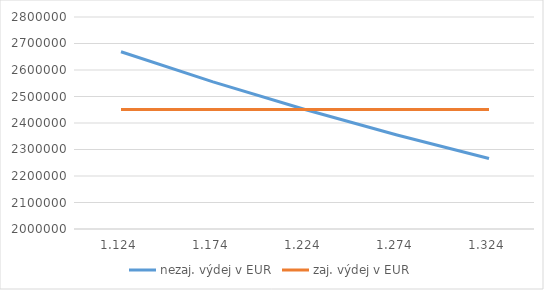
| Category | nezaj. výdej v EUR | zaj. výdej v EUR |
|---|---|---|
| 1.124 | 2669039.146 | 2450980.392 |
| 1.174 | 2555366.269 | 2450980.392 |
| 1.224 | 2450980.392 | 2450980.392 |
| 1.274 | 2354788.069 | 2450980.392 |
| 1.324 | 2265861.027 | 2450980.392 |